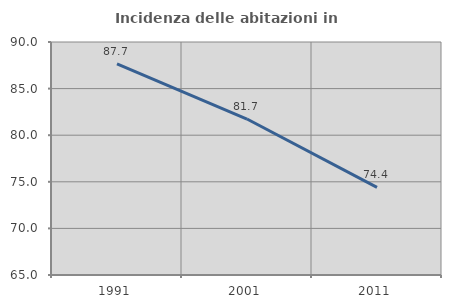
| Category | Incidenza delle abitazioni in proprietà  |
|---|---|
| 1991.0 | 87.665 |
| 2001.0 | 81.735 |
| 2011.0 | 74.408 |